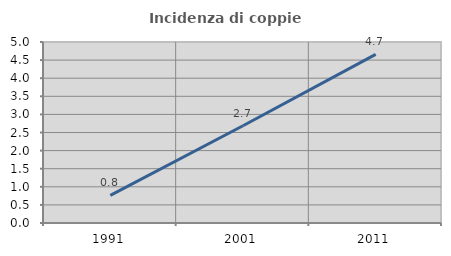
| Category | Incidenza di coppie miste |
|---|---|
| 1991.0 | 0.765 |
| 2001.0 | 2.687 |
| 2011.0 | 4.657 |